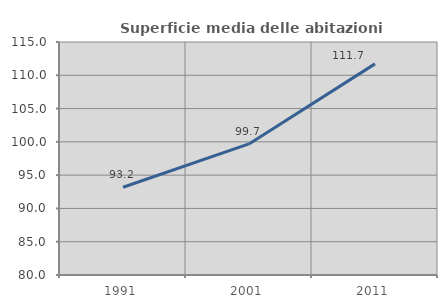
| Category | Superficie media delle abitazioni occupate |
|---|---|
| 1991.0 | 93.176 |
| 2001.0 | 99.689 |
| 2011.0 | 111.714 |